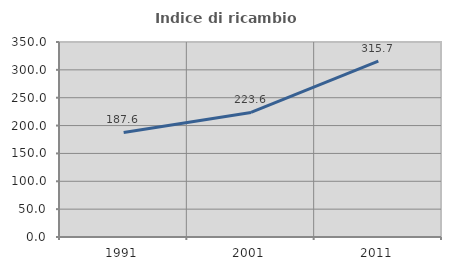
| Category | Indice di ricambio occupazionale  |
|---|---|
| 1991.0 | 187.577 |
| 2001.0 | 223.565 |
| 2011.0 | 315.695 |